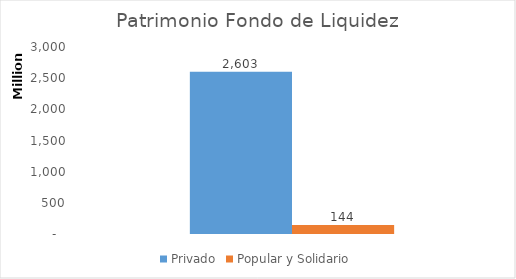
| Category | Privado | Popular y Solidario |
|---|---|---|
| 0 | 2602795981.81 | 143566075.96 |